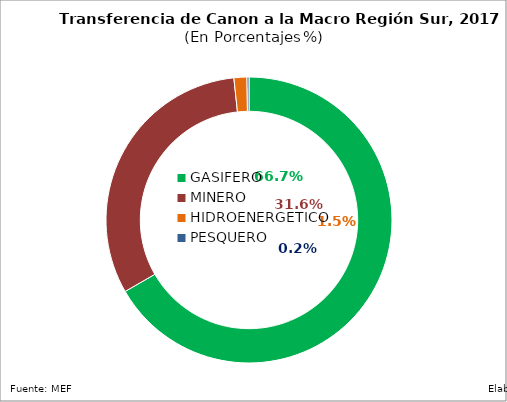
| Category | Series 0 |
|---|---|
| GASÍFERO | 1294.812 |
| MINERO | 614.324 |
| HIDROENERGÉTICO | 28.426 |
| PESQUERO | 4.367 |